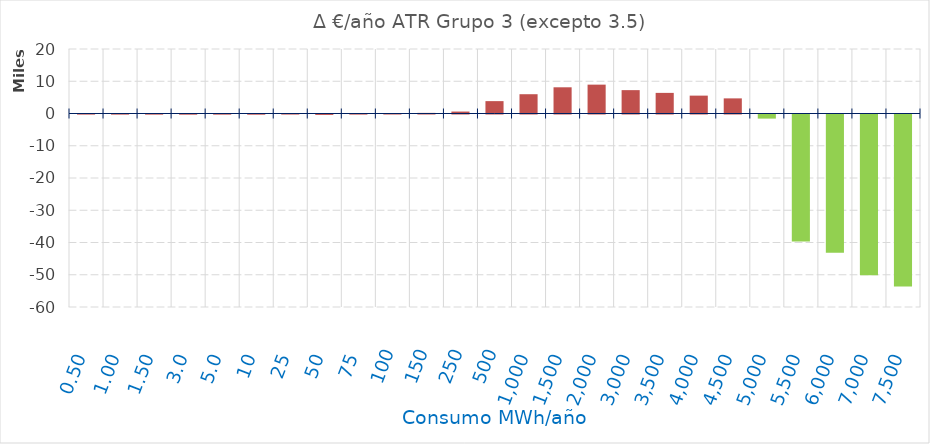
| Category | D €/año |
|---|---|
| 0.5 | -29.585 |
| 1.0 | -34.967 |
| 1.5 | -40.348 |
| 3.0 | -56.492 |
| 5.0 | -43.939 |
| 10.0 | -59.999 |
| 25.0 | -18.783 |
| 50.0 | -135.331 |
| 75.0 | -30.129 |
| 100.0 | -4.847 |
| 150.0 | 190.465 |
| 250.0 | 602.089 |
| 500.0 | 3836.125 |
| 1000.0 | 5980.741 |
| 1500.0 | 8125.358 |
| 2000.0 | 8949.659 |
| 3000.0 | 7245.197 |
| 3500.0 | 6392.966 |
| 4000.0 | 5540.735 |
| 4500.0 | 4688.504 |
| 5000.0 | -1275.363 |
| 5500.0 | -39383.168 |
| 6000.0 | -42875.125 |
| 7000.0 | -49859.04 |
| 7500.0 | -53350.997 |